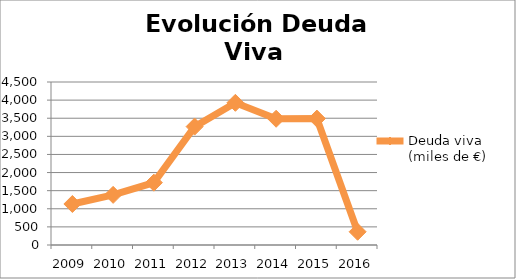
| Category | Deuda viva (miles de €) |
|---|---|
| 2009.0 | 1132 |
| 2010.0 | 1384 |
| 2011.0 | 1721 |
| 2012.0 | 3268.347 |
| 2013.0 | 3925.24 |
| 2014.0 | 3485.24 |
| 2015.0 | 3490 |
| 2016.0 | 365.437 |